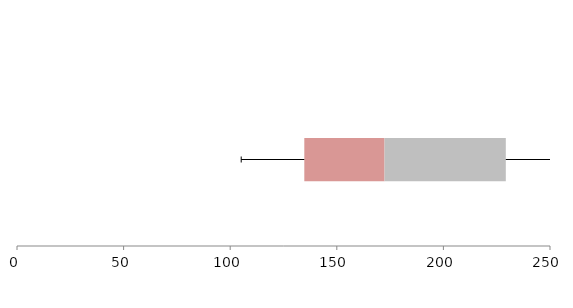
| Category | Series 1 | Series 2 | Series 3 |
|---|---|---|---|
| 0 | 134.759 | 37.636 | 56.876 |